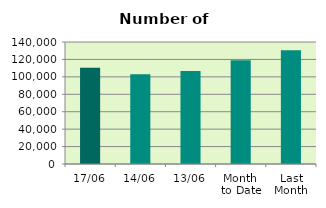
| Category | Series 0 |
|---|---|
| 17/06 | 110434 |
| 14/06 | 102944 |
| 13/06 | 106798 |
| Month 
to Date | 119192.545 |
| Last
Month | 130647.636 |